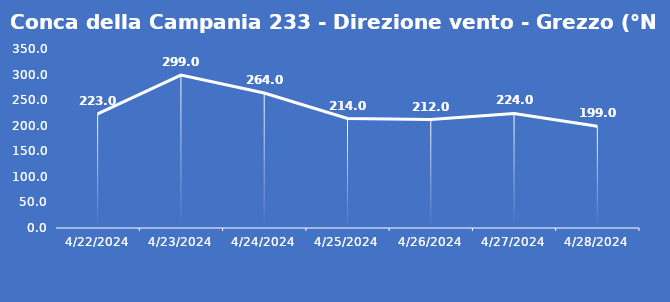
| Category | Conca della Campania 233 - Direzione vento - Grezzo (°N) |
|---|---|
| 4/22/24 | 223 |
| 4/23/24 | 299 |
| 4/24/24 | 264 |
| 4/25/24 | 214 |
| 4/26/24 | 212 |
| 4/27/24 | 224 |
| 4/28/24 | 199 |